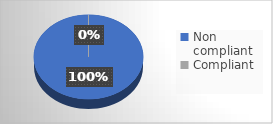
| Category | Series 0 |
|---|---|
| Non compliant | 4 |
| Compliant | 0 |